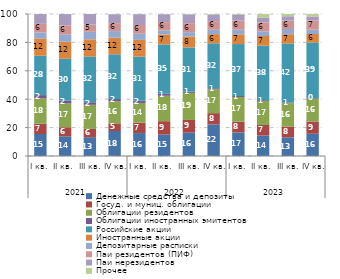
| Category | Денежные средства и депозиты | Госуд. и муниц. облигации | Облигации резидентов | Облигации иностранных эмитентов | Российские акции | Иностранные акции | Депозитарные расписки | Паи резидентов (ПИФ) | Паи нерезидентов | Прочее |
|---|---|---|---|---|---|---|---|---|---|---|
| 0 | 15.498 | 7.304 | 17.932 | 2.153 | 27.714 | 12.226 | 4.209 | 6.034 | 6.9 | 0.031 |
| 1 | 13.862 | 6.387 | 16.762 | 1.954 | 29.515 | 12.006 | 5.219 | 6.187 | 8.075 | 0.033 |
| 2 | 13.243 | 5.842 | 16.982 | 1.775 | 32.274 | 12.055 | 5.265 | 5.102 | 7.427 | 0.035 |
| 3 | 17.588 | 5.392 | 15.586 | 1.545 | 31.519 | 11.698 | 4.637 | 5.579 | 6.308 | 0.148 |
| 4 | 16.148 | 7.383 | 13.862 | 1.535 | 31.044 | 11.804 | 4.309 | 6.171 | 7.634 | 0.11 |
| 5 | 15.07 | 9.454 | 17.919 | 1.377 | 34.746 | 6.943 | 2.965 | 5.801 | 5.608 | 0.117 |
| 6 | 16.433 | 8.958 | 19.069 | 0.892 | 31.094 | 7.729 | 3.035 | 6.333 | 6.217 | 0.241 |
| 7 | 22.233 | 7.94 | 16.81 | 0.741 | 31.651 | 6.437 | 3.08 | 6.062 | 4.743 | 0.303 |
| 8 | 16.578 | 7.639 | 17.332 | 0.683 | 36.607 | 6.872 | 3.212 | 6.491 | 4.247 | 0.338 |
| 9 | 14.42 | 7.398 | 16.888 | 0.619 | 38.376 | 6.796 | 3.354 | 6.263 | 3.37 | 2.517 |
| 10 | 13.142 | 7.552 | 16.455 | 0.521 | 41.586 | 6.515 | 3.654 | 5.912 | 3.075 | 1.587 |
| 11 | 15.67 | 8.648 | 15.966 | 0.465 | 39.148 | 6.022 | 3.008 | 6.573 | 2.789 | 1.712 |